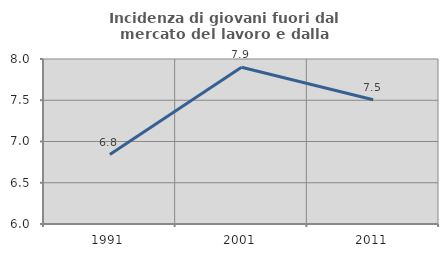
| Category | Incidenza di giovani fuori dal mercato del lavoro e dalla formazione  |
|---|---|
| 1991.0 | 6.842 |
| 2001.0 | 7.9 |
| 2011.0 | 7.507 |